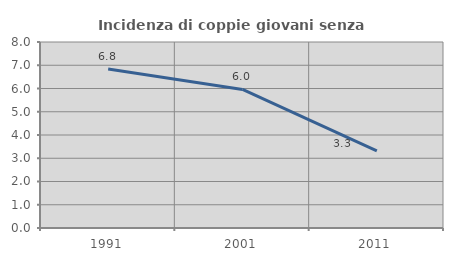
| Category | Incidenza di coppie giovani senza figli |
|---|---|
| 1991.0 | 6.836 |
| 2001.0 | 5.961 |
| 2011.0 | 3.321 |